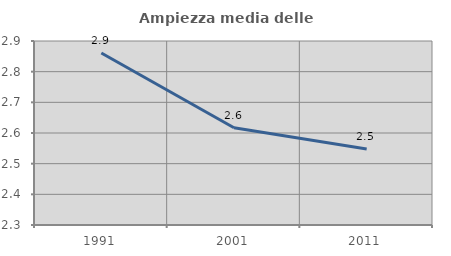
| Category | Ampiezza media delle famiglie |
|---|---|
| 1991.0 | 2.861 |
| 2001.0 | 2.617 |
| 2011.0 | 2.548 |